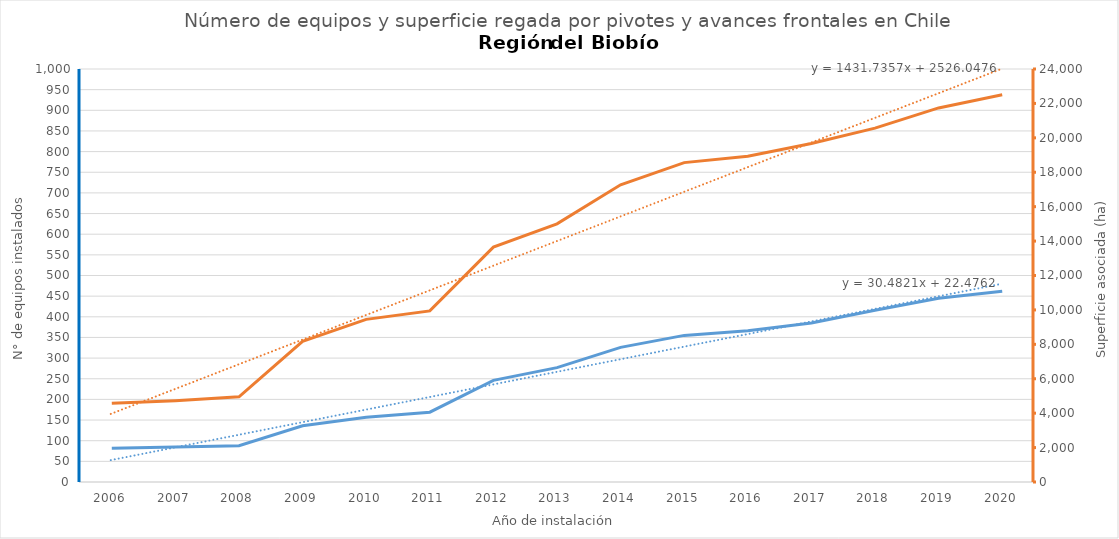
| Category | N° |
|---|---|
| 2006.0 | 82 |
| 2007.0 | 85 |
| 2008.0 | 88 |
| 2009.0 | 136 |
| 2010.0 | 157 |
| 2011.0 | 169 |
| 2012.0 | 246 |
| 2013.0 | 277 |
| 2014.0 | 326 |
| 2015.0 | 355 |
| 2016.0 | 366 |
| 2017.0 | 385 |
| 2018.0 | 416 |
| 2019.0 | 445 |
| 2020.0 | 462 |